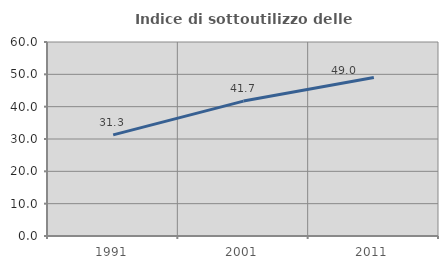
| Category | Indice di sottoutilizzo delle abitazioni  |
|---|---|
| 1991.0 | 31.271 |
| 2001.0 | 41.722 |
| 2011.0 | 49.004 |